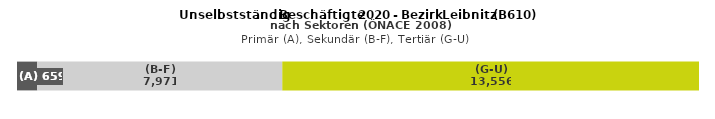
| Category | (A) | (B-F) | (G-U) |
|---|---|---|---|
| 0 | 659 | 7971 | 13556 |